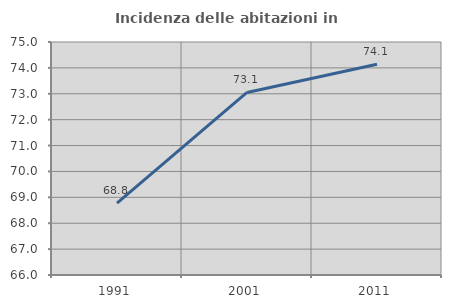
| Category | Incidenza delle abitazioni in proprietà  |
|---|---|
| 1991.0 | 68.776 |
| 2001.0 | 73.051 |
| 2011.0 | 74.138 |